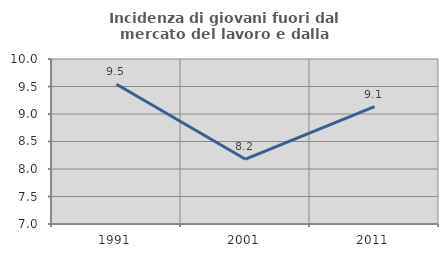
| Category | Incidenza di giovani fuori dal mercato del lavoro e dalla formazione  |
|---|---|
| 1991.0 | 9.542 |
| 2001.0 | 8.178 |
| 2011.0 | 9.135 |